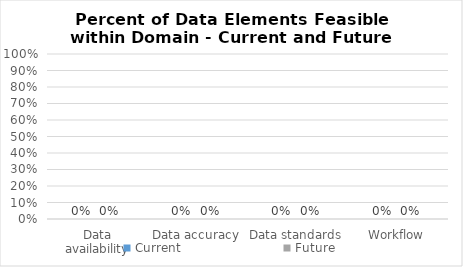
| Category | Current | Future |
|---|---|---|
| Data availability | 0 | 0 |
| Data accuracy | 0 | 0 |
| Data standards | 0 | 0 |
| Workflow | 0 | 0 |